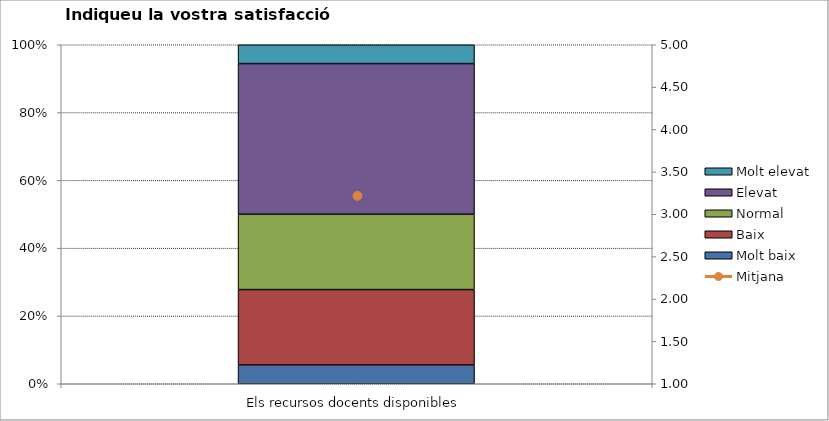
| Category | Molt baix | Baix | Normal  | Elevat | Molt elevat |
|---|---|---|---|---|---|
| Els recursos docents disponibles | 1 | 4 | 4 | 8 | 1 |